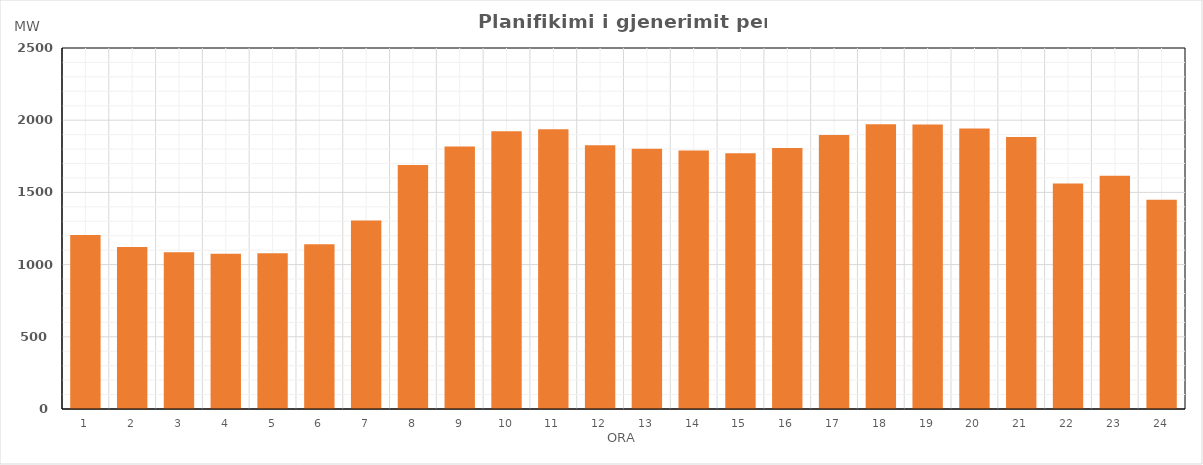
| Category | Max (MW) |
|---|---|
| 0 | 1205.467 |
| 1 | 1121.053 |
| 2 | 1086.03 |
| 3 | 1075.03 |
| 4 | 1079.03 |
| 5 | 1141.215 |
| 6 | 1306.03 |
| 7 | 1689.694 |
| 8 | 1817.493 |
| 9 | 1923.03 |
| 10 | 1938.03 |
| 11 | 1826.03 |
| 12 | 1801.951 |
| 13 | 1789.833 |
| 14 | 1770.701 |
| 15 | 1806.816 |
| 16 | 1897.831 |
| 17 | 1972.321 |
| 18 | 1970.315 |
| 19 | 1943.155 |
| 20 | 1883.182 |
| 21 | 1562.498 |
| 22 | 1614.726 |
| 23 | 1448.742 |